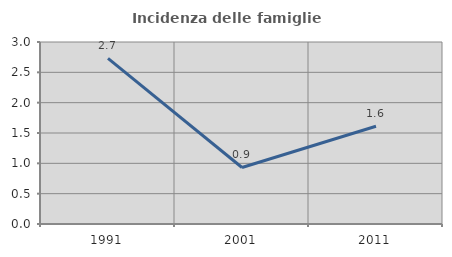
| Category | Incidenza delle famiglie numerose |
|---|---|
| 1991.0 | 2.73 |
| 2001.0 | 0.931 |
| 2011.0 | 1.612 |